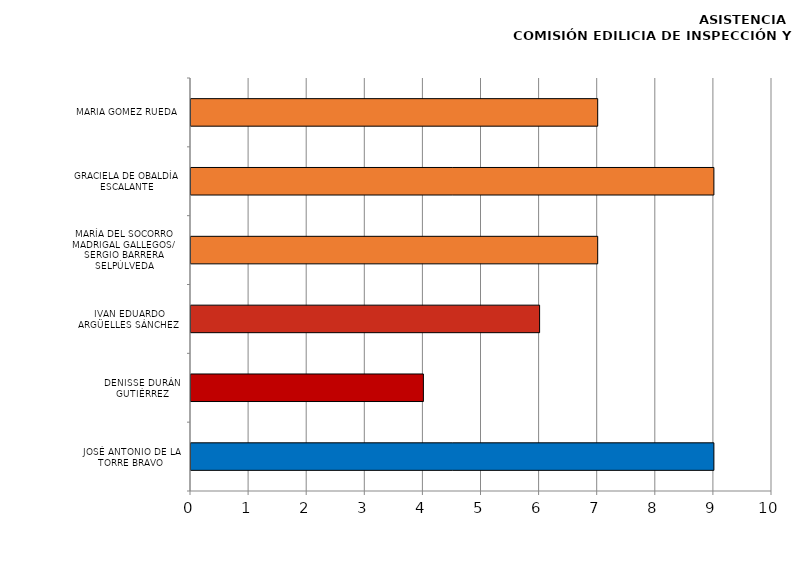
| Category | Series 0 |
|---|---|
| JOSÉ ANTONIO DE LA TORRE BRAVO | 9 |
| DENISSE DURÁN GUTIÉRREZ | 4 |
| IVAN EDUARDO ARGÜELLES SÁNCHEZ | 6 |
| MARÍA DEL SOCORRO MADRIGAL GALLEGOS/
SERGIO BARRERA SELPÚLVEDA | 7 |
| GRACIELA DE OBALDÍA ESCALANTE | 9 |
| MARÍA GOMEZ RUEDA | 7 |